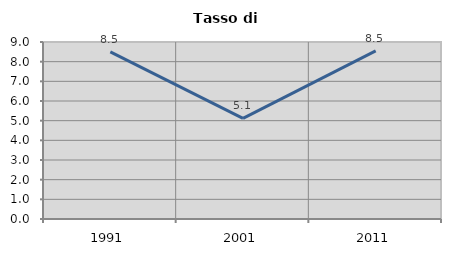
| Category | Tasso di disoccupazione   |
|---|---|
| 1991.0 | 8.494 |
| 2001.0 | 5.121 |
| 2011.0 | 8.55 |